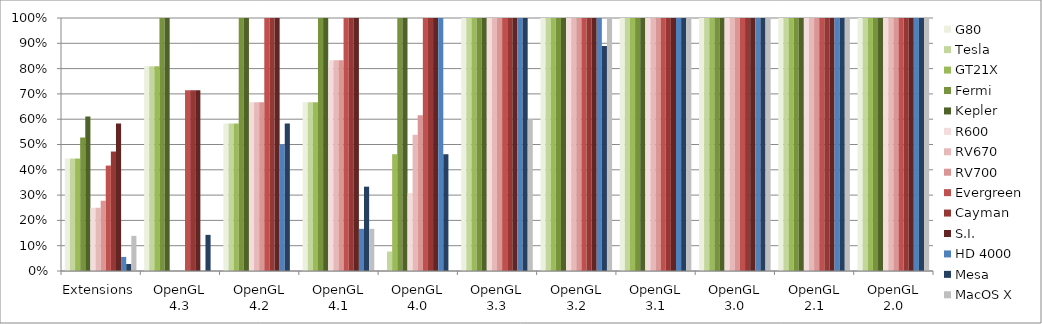
| Category | G80 | Tesla | GT21X | Fermi | Kepler | R600 | RV670 | RV700 | Evergreen | Cayman | S.I. | HD 4000 | Mesa | MacOS X |
|---|---|---|---|---|---|---|---|---|---|---|---|---|---|---|
| Extensions | 0.444 | 0.444 | 0.444 | 0.528 | 0.611 | 0.25 | 0.25 | 0.278 | 0.417 | 0.472 | 0.583 | 0.056 | 0.028 | 0.139 |
| OpenGL 4.3 | 0.81 | 0.81 | 0.81 | 1 | 1 | 0 | 0 | 0 | 0.714 | 0.714 | 0.714 | 0 | 0.143 | 0 |
| OpenGL 4.2 | 0.583 | 0.583 | 0.583 | 1 | 1 | 0.667 | 0.667 | 0.667 | 1 | 1 | 1 | 0.5 | 0.583 | 0 |
| OpenGL 4.1 | 0.667 | 0.667 | 0.667 | 1 | 1 | 0.833 | 0.833 | 0.833 | 1 | 1 | 1 | 0.167 | 0.333 | 0.167 |
| OpenGL 4.0 | 0 | 0.077 | 0.462 | 1 | 1 | 0.308 | 0.538 | 0.615 | 1 | 1 | 1 | 1 | 0.462 | 0 |
| OpenGL 3.3 | 1 | 1 | 1 | 1 | 1 | 1 | 1 | 1 | 1 | 1 | 1 | 1 | 1 | 0.6 |
| OpenGL 3.2 | 1 | 1 | 1 | 1 | 1 | 1 | 1 | 1 | 1 | 1 | 1 | 1 | 0.889 | 1 |
| OpenGL 3.1 | 1 | 1 | 1 | 1 | 1 | 1 | 1 | 1 | 1 | 1 | 1 | 1 | 1 | 1 |
| OpenGL 3.0 | 1 | 1 | 1 | 1 | 1 | 1 | 1 | 1 | 1 | 1 | 1 | 1 | 1 | 1 |
| OpenGL 2.1 | 1 | 1 | 1 | 1 | 1 | 1 | 1 | 1 | 1 | 1 | 1 | 1 | 1 | 1 |
| OpenGL 2.0 | 1 | 1 | 1 | 1 | 1 | 1 | 1 | 1 | 1 | 1 | 1 | 1 | 1 | 1 |